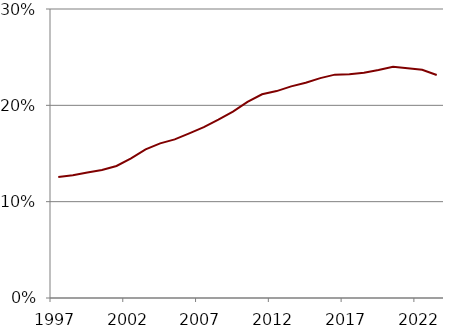
| Category | Series 0 |
|---|---|
| 1997.0 | 0.126 |
| 1998.0 | 0.127 |
| 1999.0 | 0.13 |
| 2000.0 | 0.133 |
| 2001.0 | 0.137 |
| 2002.0 | 0.145 |
| 2003.0 | 0.154 |
| 2004.0 | 0.161 |
| 2005.0 | 0.165 |
| 2006.0 | 0.171 |
| 2007.0 | 0.177 |
| 2008.0 | 0.185 |
| 2009.0 | 0.193 |
| 2010.0 | 0.204 |
| 2011.0 | 0.211 |
| 2012.0 | 0.215 |
| 2013.0 | 0.22 |
| 2014.0 | 0.223 |
| 2015.0 | 0.228 |
| 2016.0 | 0.232 |
| 2017.0 | 0.232 |
| 2018.0 | 0.234 |
| 2019.0 | 0.237 |
| 2020.0 | 0.24 |
| 2021.0 | 0.238 |
| 2022.0 | 0.237 |
| 2023.0 | 0.231 |